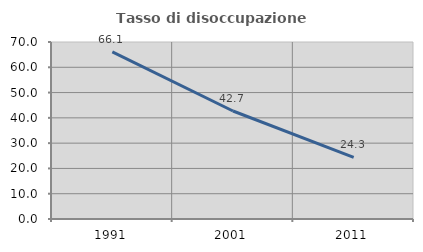
| Category | Tasso di disoccupazione giovanile  |
|---|---|
| 1991.0 | 66.09 |
| 2001.0 | 42.708 |
| 2011.0 | 24.342 |